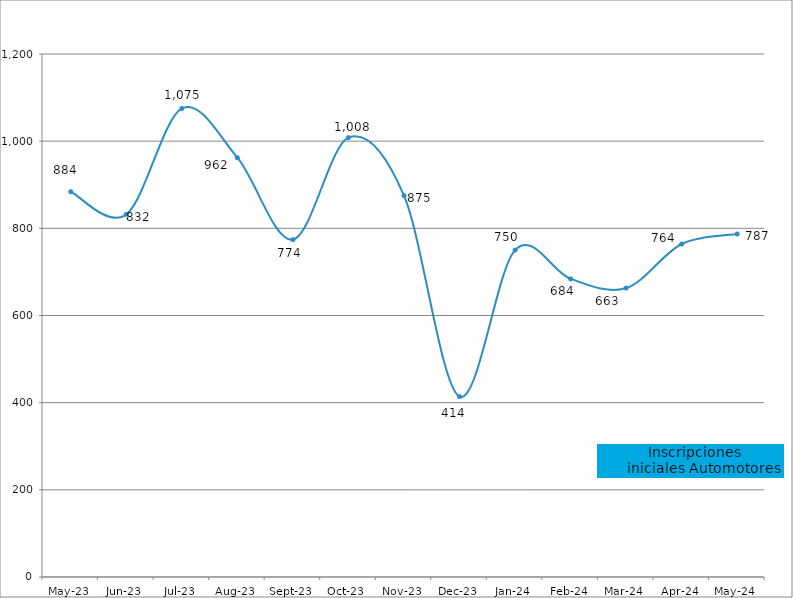
| Category | Inscripciones
iniciales |
|---|---|
| 2023-05-01 | 884 |
| 2023-06-01 | 832 |
| 2023-07-01 | 1075 |
| 2023-08-01 | 962 |
| 2023-09-01 | 774 |
| 2023-10-01 | 1008 |
| 2023-11-01 | 875 |
| 2023-12-01 | 414 |
| 2024-01-01 | 750 |
| 2024-02-01 | 684 |
| 2024-03-01 | 663 |
| 2024-04-01 | 764 |
| 2024-05-01 | 787 |